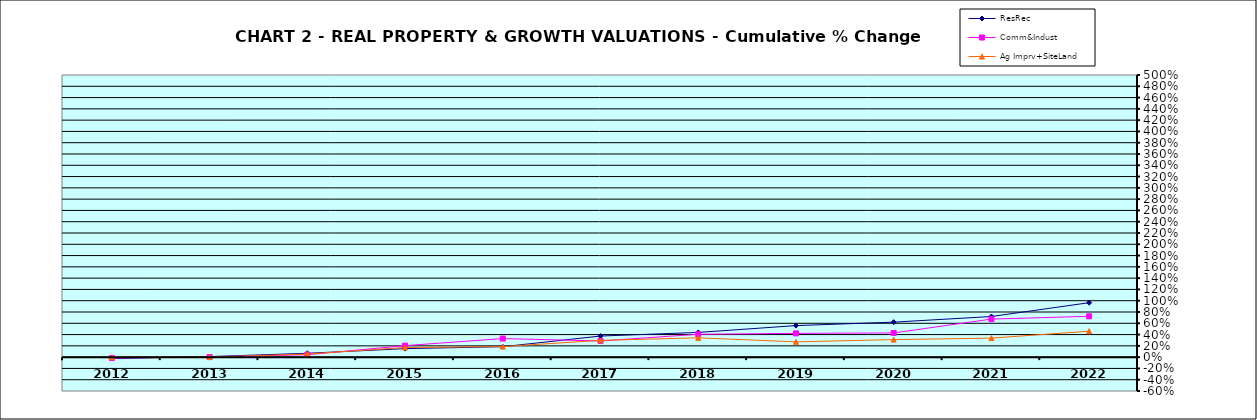
| Category | ResRec | Comm&Indust | Ag Imprv+SiteLand |
|---|---|---|---|
| 2012.0 | -0.024 | -0.015 | 0 |
| 2013.0 | 0.01 | 0.003 | 0 |
| 2014.0 | 0.068 | 0.043 | 0.055 |
| 2015.0 | 0.151 | 0.204 | 0.171 |
| 2016.0 | 0.185 | 0.329 | 0.187 |
| 2017.0 | 0.374 | 0.286 | 0.297 |
| 2018.0 | 0.438 | 0.406 | 0.342 |
| 2019.0 | 0.559 | 0.421 | 0.271 |
| 2020.0 | 0.62 | 0.429 | 0.311 |
| 2021.0 | 0.72 | 0.674 | 0.337 |
| 2022.0 | 0.965 | 0.723 | 0.46 |